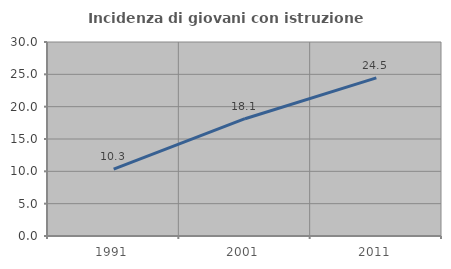
| Category | Incidenza di giovani con istruzione universitaria |
|---|---|
| 1991.0 | 10.348 |
| 2001.0 | 18.136 |
| 2011.0 | 24.456 |